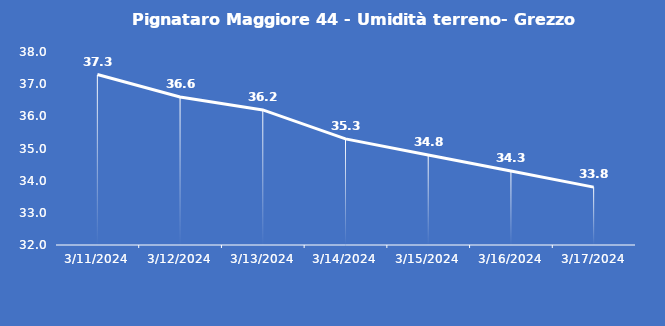
| Category | Pignataro Maggiore 44 - Umidità terreno- Grezzo (%VWC) |
|---|---|
| 3/11/24 | 37.3 |
| 3/12/24 | 36.6 |
| 3/13/24 | 36.2 |
| 3/14/24 | 35.3 |
| 3/15/24 | 34.8 |
| 3/16/24 | 34.3 |
| 3/17/24 | 33.8 |